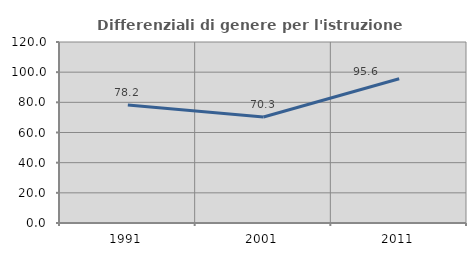
| Category | Differenziali di genere per l'istruzione superiore |
|---|---|
| 1991.0 | 78.173 |
| 2001.0 | 70.292 |
| 2011.0 | 95.61 |